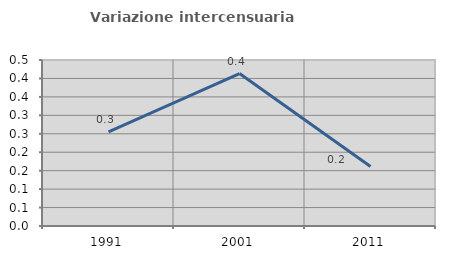
| Category | Variazione intercensuaria annua |
|---|---|
| 1991.0 | 0.255 |
| 2001.0 | 0.413 |
| 2011.0 | 0.161 |